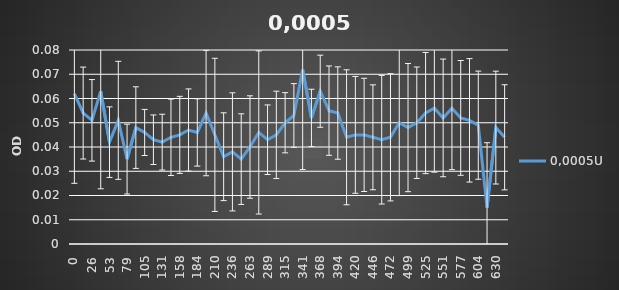
| Category | 0,0005U |
|---|---|
| 0.0 | 0.062 |
| 13.0 | 0.054 |
| 26.0 | 0.051 |
| 39.0 | 0.063 |
| 53.0 | 0.042 |
| 66.0 | 0.051 |
| 79.0 | 0.035 |
| 92.0 | 0.048 |
| 105.0 | 0.046 |
| 118.0 | 0.043 |
| 131.0 | 0.042 |
| 144.0 | 0.044 |
| 158.0 | 0.045 |
| 171.0 | 0.047 |
| 184.0 | 0.046 |
| 197.0 | 0.054 |
| 210.0 | 0.045 |
| 223.0 | 0.036 |
| 236.0 | 0.038 |
| 249.0 | 0.035 |
| 263.0 | 0.04 |
| 276.0 | 0.046 |
| 289.0 | 0.043 |
| 302.0 | 0.045 |
| 315.0 | 0.05 |
| 328.0 | 0.053 |
| 341.0 | 0.072 |
| 354.0 | 0.052 |
| 368.0 | 0.063 |
| 381.0 | 0.055 |
| 394.0 | 0.054 |
| 407.0 | 0.044 |
| 420.0 | 0.045 |
| 433.0 | 0.045 |
| 446.0 | 0.044 |
| 459.0 | 0.043 |
| 472.0 | 0.044 |
| 486.0 | 0.05 |
| 499.0 | 0.048 |
| 512.0 | 0.05 |
| 525.0 | 0.054 |
| 538.0 | 0.056 |
| 551.0 | 0.052 |
| 564.0 | 0.056 |
| 577.0 | 0.052 |
| 591.0 | 0.051 |
| 604.0 | 0.049 |
| 617.0 | 0.015 |
| 630.0 | 0.048 |
| 643.0 | 0.044 |